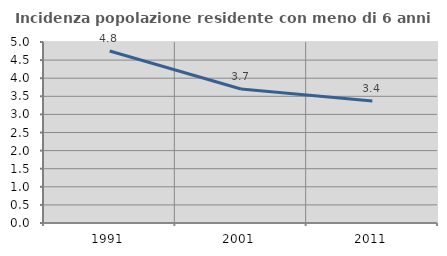
| Category | Incidenza popolazione residente con meno di 6 anni |
|---|---|
| 1991.0 | 4.752 |
| 2001.0 | 3.701 |
| 2011.0 | 3.372 |